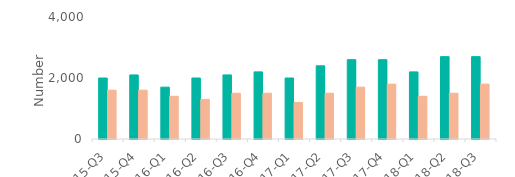
| Category | First-time
buyers | Home movers |
|---|---|---|
| 15-Q3 | 2000 | 1600 |
| 15-Q4 | 2100 | 1600 |
| 16-Q1 | 1700 | 1400 |
| 16-Q2 | 2000 | 1300 |
| 16-Q3 | 2100 | 1500 |
| 16-Q4 | 2200 | 1500 |
| 17-Q1 | 2000 | 1200 |
| 17-Q2 | 2400 | 1500 |
| 17-Q3 | 2600 | 1700 |
| 17-Q4 | 2600 | 1800 |
| 18-Q1 | 2200 | 1400 |
| 18-Q2 | 2700 | 1500 |
| 18-Q3 | 2700 | 1800 |